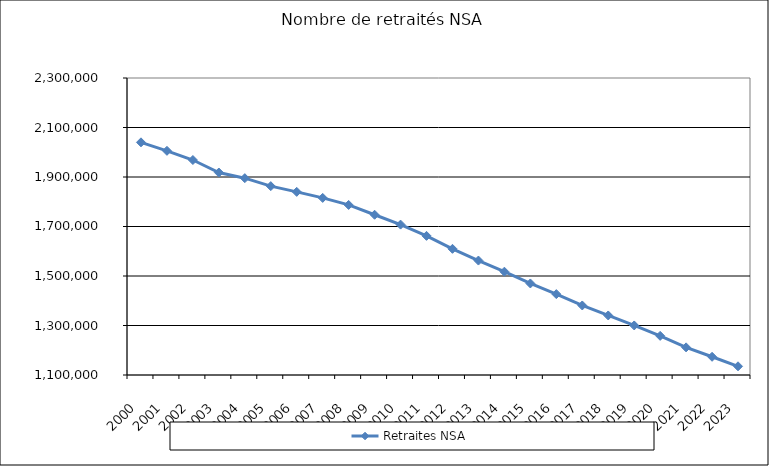
| Category | Retraites NSA |
|---|---|
| 2000.0 | 2040033 |
| 2001.0 | 2005802 |
| 2002.0 | 1968606 |
| 2003.0 | 1918080 |
| 2004.0 | 1895279 |
| 2005.0 | 1863109 |
| 2006.0 | 1839904 |
| 2007.0 | 1815507 |
| 2008.0 | 1787171 |
| 2009.0 | 1747453 |
| 2010.0 | 1707668 |
| 2011.0 | 1662131 |
| 2012.0 | 1609842 |
| 2013.0 | 1562430 |
| 2014.0 | 1517389 |
| 2015.0 | 1469844 |
| 2016.0 | 1426811 |
| 2017.0 | 1380904 |
| 2018.0 | 1340581 |
| 2019.0 | 1300239 |
| 2020.0 | 1258098 |
| 2021.0 | 1211645 |
| 2022.0 | 1173608 |
| 2023.0 | 1135142 |